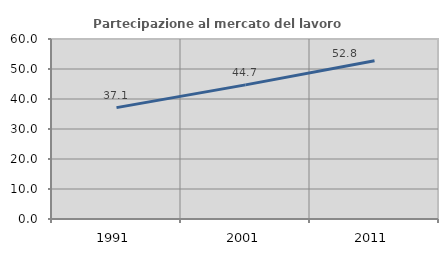
| Category | Partecipazione al mercato del lavoro  femminile |
|---|---|
| 1991.0 | 37.124 |
| 2001.0 | 44.707 |
| 2011.0 | 52.759 |